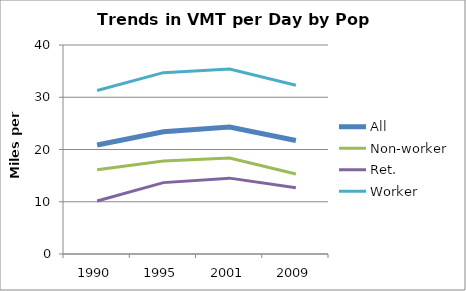
| Category | All | Non-worker | Ret. | Worker |
|---|---|---|---|---|
| 1990.0 | 20.85 | 16.11 | 10.14 | 31.28 |
| 1995.0 | 23.39 | 17.8 | 13.66 | 34.71 |
| 2001.0 | 24.31 | 18.37 | 14.52 | 35.4 |
| 2009.0 | 21.73 | 15.32 | 12.67 | 32.3 |